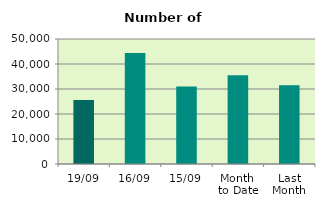
| Category | Series 0 |
|---|---|
| 19/09 | 25616 |
| 16/09 | 44444 |
| 15/09 | 30970 |
| Month 
to Date | 35455.231 |
| Last
Month | 31456 |